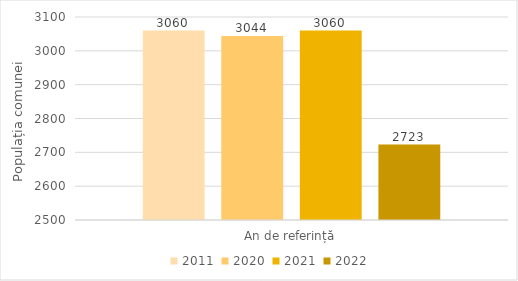
| Category | 2011 | 2020 | 2021 | 2022 |
|---|---|---|---|---|
| An de referință | 3060 | 3044 | 3060 | 2723 |